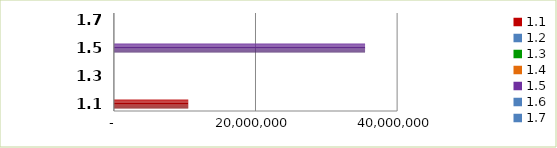
| Category | Series 0 |
|---|---|
| 1.1 | 10503018.13 |
| 1.2 | 0 |
| 1.3 | 0 |
| 1.4 | 0 |
| 1.5 | 35478139.84 |
| 1.6 | 0 |
| 1.7 | 0 |